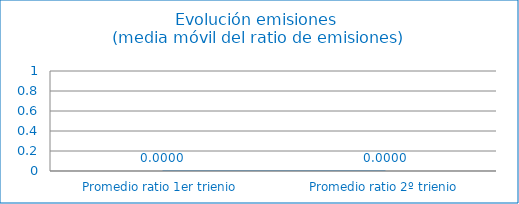
| Category | Series 0 |
|---|---|
| Promedio ratio 1er trienio | 0 |
| Promedio ratio 2º trienio | 0 |